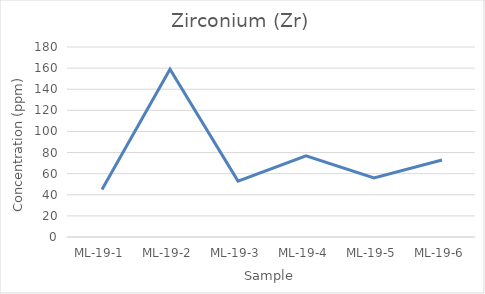
| Category | Series 0 |
|---|---|
| ML-19-1 | 45 |
| ML-19-2 | 159 |
| ML-19-3 | 53 |
| ML-19-4 | 77 |
| ML-19-5 | 56 |
| ML-19-6 | 73 |